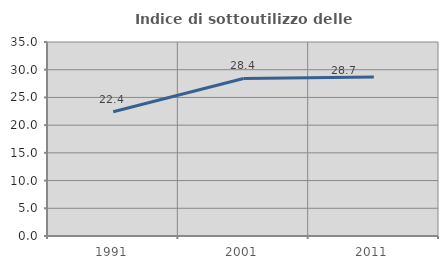
| Category | Indice di sottoutilizzo delle abitazioni  |
|---|---|
| 1991.0 | 22.416 |
| 2001.0 | 28.427 |
| 2011.0 | 28.685 |